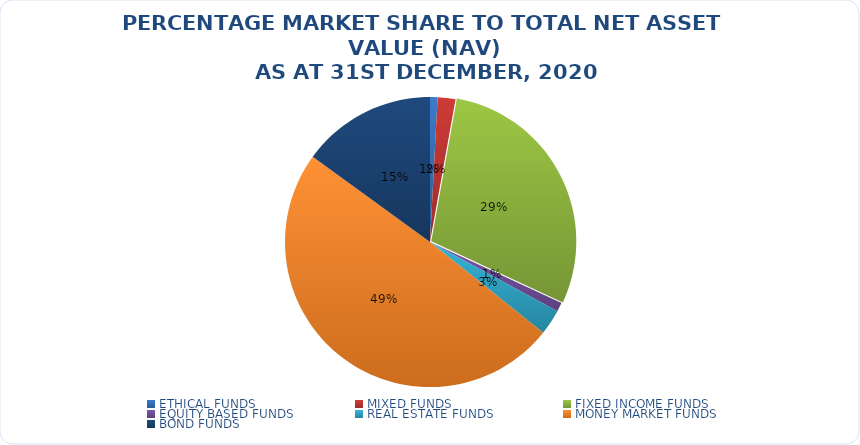
| Category | NET ASSET VALUE |
|---|---|
| ETHICAL FUNDS | 12484919084.96 |
| MIXED FUNDS | 29632958911.521 |
| FIXED INCOME FUNDS | 434650230110.768 |
| EQUITY BASED FUNDS | 14986399213.01 |
| REAL ESTATE FUNDS | 42306959892.689 |
| MONEY MARKET FUNDS | 735762469741.909 |
| BOND FUNDS | 223937697842.49 |